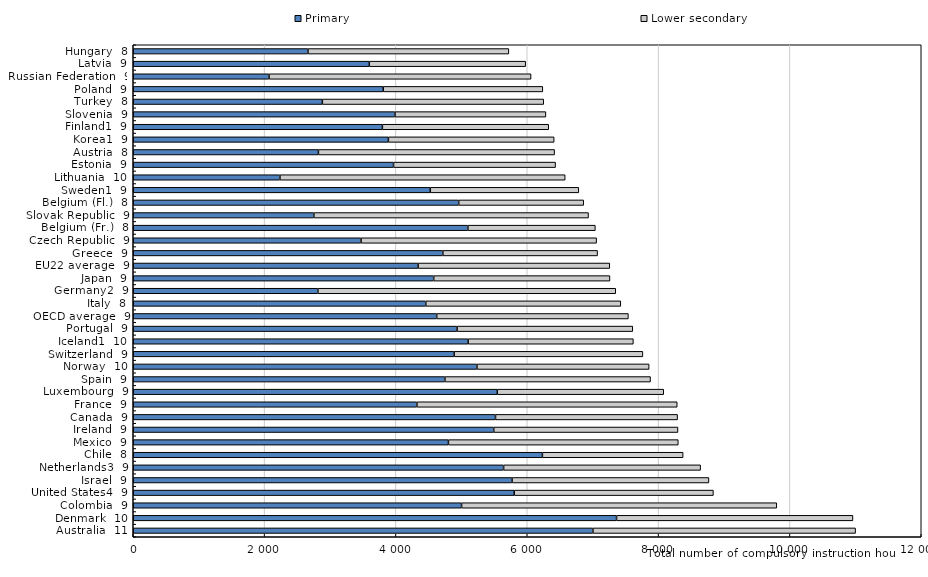
| Category | Primary | Lower secondary |
|---|---|---|
| Australia  11 | 7000 | 4000 |
| Denmark  10 | 7360 | 3600 |
| Colombia  9 | 5000 | 4800 |
| United States4  9 | 5802 | 3033 |
| Israel  9 | 5768.851 | 2997.796 |
| Netherlands3  9 | 5640 | 3000 |
| Chile  8 | 6231 | 2142.75 |
| Mexico  9 | 4800 | 3500 |
| Ireland  9 | 5490 | 2805.6 |
| Canada  9 | 5516.748 | 2772.858 |
| France  9 | 4320 | 3964 |
| Luxembourg  9 | 5544 | 2535 |
| Spain  9 | 4746.077 | 3131.712 |
| Norway  10 | 5234 | 2622 |
| Switzerland  9 | 4887 | 2874 |
| Iceland1  10 | 5100 | 2516 |
| Portugal  9 | 4932 | 2675.25 |
| OECD average  9 | 4621.058 | 2919.231 |
| Italy  8 | 4455 | 2970 |
| Germany2  9 | 2811.732 | 4536.288 |
| Japan  9 | 4575.465 | 2684.112 |
| EU22 average  9 | 4337.98 | 2918.9 |
| Greece  9 | 4714.989 | 2356.228 |
| Czech Republic  9 | 3469.2 | 3586.8 |
| Belgium (Fr.)  8 | 5096 | 1941.333 |
| Slovak Republic  9 | 2750.4 | 4182.9 |
| Belgium (Fl.)  8 | 4956 | 1904 |
| Sweden1  9 | 4523.333 | 2261.667 |
| Lithuania  10 | 2233.92 | 4343.439 |
| Estonia  9 | 3963.75 | 2467.5 |
| Austria  8 | 2820 | 3596.559 |
| Korea1  9 | 3885.333 | 2524.5 |
| Finland1  9 | 3793.825 | 2533.175 |
| Slovenia  9 | 3986.25 | 2297.645 |
| Turkey  8 | 2880 | 3371.04 |
| Poland  9 | 3807 | 2430 |
| Russian Federation  9 | 2068 | 3990 |
| Latvia  9 | 3595.013 | 2381.333 |
| Hungary  8 | 2661 | 3058.8 |